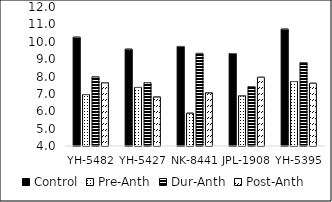
| Category | Control | Pre-Anth | Dur-Anth | Post-Anth |
|---|---|---|---|---|
| YH-5482 | 10.26 | 6.96 | 7.986 | 7.643 |
| YH-5427 | 9.573 | 7.369 | 7.647 | 6.829 |
| NK-8441 | 9.729 | 5.887 | 9.33 | 7.067 |
| JPL-1908 | 9.324 | 6.893 | 7.424 | 7.955 |
| YH-5395 | 10.727 | 7.71 | 8.8 | 7.611 |